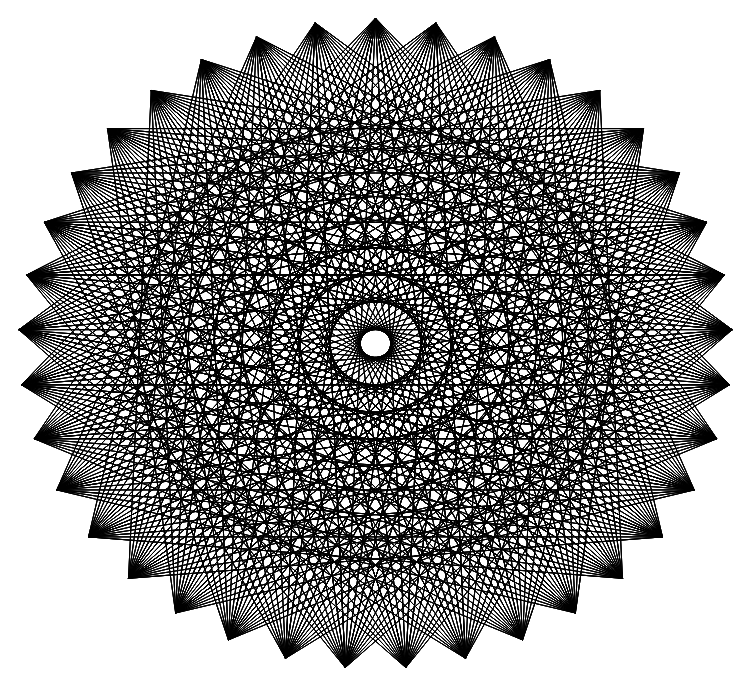
| Category | Series 0 |
|---|---|
| 0.0 | 1 |
| 0.0848059244755095 | -0.996 |
| -0.3331397947420577 | 0.943 |
| 0.6919388689775462 | -0.722 |
| -0.9775552389476861 | 0.211 |
| 0.8515291377333113 | 0.524 |
| -0.08480592447550882 | -0.996 |
| -0.8515291377333117 | 0.524 |
| 0.7506723052527243 | 0.661 |
| 0.5599747861375954 | -0.829 |
| -0.6282199972956423 | 0.778 |
| 0.8039971303669405 | -0.595 |
| -0.9775552389476861 | 0.211 |
| 0.9278890272965093 | 0.373 |
| -0.4119012482439926 | -0.911 |
| -0.4876949438136342 | 0.873 |
| 0.9990989662046814 | 0.042 |
| -0.2519780613851252 | -0.968 |
| -0.9278890272965095 | 0.373 |
| 0.9561667347392511 | -0.293 |
| -0.9990989662046815 | 0.042 |
| 0.9278890272965093 | 0.373 |
| -0.5599747861375949 | -0.829 |
| -0.16900082032184968 | 0.986 |
| 0.8929258581495685 | -0.45 |
| -0.8039971303669406 | -0.595 |
| -0.3331397947420577 | 0.943 |
| 0.9775552389476861 | 0.211 |
| -0.956166734739251 | -0.293 |
| 0.8515291377333113 | 0.524 |
| -0.5599747861375949 | -0.829 |
| 0.0 | 1 |
| 0.6919388689775462 | -0.722 |
| -0.9919004352588768 | -0.127 |
| 0.33313979474205757 | 0.943 |
| 0.8039971303669405 | -0.595 |
| -0.6919388689775461 | -0.722 |
| 0.6282199972956423 | 0.778 |
| -0.4119012482439926 | -0.911 |
| 0.0 | 1 |
| 0.5599747861375954 | -0.829 |
| -0.9775552389476861 | 0.211 |
| 0.7506723052527243 | 0.661 |
| 0.251978061385125 | -0.968 |
| -0.9990989662046815 | 0.042 |
| 0.16900082032184907 | 0.986 |
| -0.08480592447550882 | -0.996 |
| -0.16900082032184968 | 0.986 |
| 0.5599747861375954 | -0.829 |
| -0.9278890272965095 | 0.373 |
| 0.9278890272965093 | 0.373 |
| -0.2519780613851252 | -0.968 |
| -0.7506723052527245 | 0.661 |
| 0.8515291377333113 | 0.524 |
| 0.4119012482439928 | -0.911 |
| -0.4876949438136342 | 0.873 |
| 0.6919388689775462 | -0.722 |
| -0.9278890272965095 | 0.373 |
| 0.9775552389476861 | 0.211 |
| -0.5599747861375949 | -0.829 |
| -0.3331397947420577 | 0.943 |
| 0.9919004352588768 | -0.127 |
| -0.4119012482439926 | -0.911 |
| -0.8515291377333117 | 0.524 |
| 0.8929258581495685 | -0.45 |
| -0.9775552389476861 | 0.211 |
| 0.9775552389476861 | 0.211 |
| -0.6919388689775461 | -0.722 |
| 0.0 | 1 |
| 0.8039971303669405 | -0.595 |
| -0.8929258581495684 | -0.45 |
| -0.16900082032184968 | 0.986 |
| 0.9990989662046814 | 0.042 |
| -0.9919004352588768 | -0.127 |
| 0.9278890272965093 | 0.373 |
| -0.6919388689775461 | -0.722 |
| 0.16900082032184907 | 0.986 |
| 0.5599747861375954 | -0.829 |
| -0.9990989662046815 | 0.042 |
| 0.48769494381363454 | 0.873 |
| 0.6919388689775462 | -0.722 |
| -0.8039971303669406 | -0.595 |
| 0.7506723052527243 | 0.661 |
| -0.5599747861375949 | -0.829 |
| 0.16900082032184907 | 0.986 |
| 0.4119012482439928 | -0.911 |
| -0.9278890272965095 | 0.373 |
| 0.8515291377333113 | 0.524 |
| 0.0848059244755095 | -0.996 |
| -0.9775552389476861 | 0.211 |
| 0.33313979474205757 | 0.943 |
| -0.2519780613851252 | -0.968 |
| 0.0 | 1 |
| 0.4119012482439928 | -0.911 |
| -0.8515291377333117 | 0.524 |
| 0.9775552389476861 | 0.211 |
| -0.4119012482439926 | -0.911 |
| -0.6282199972956423 | 0.778 |
| 0.9278890272965093 | 0.373 |
| 0.251978061385125 | -0.968 |
| -0.3331397947420577 | 0.943 |
| 0.5599747861375954 | -0.829 |
| -0.8515291377333117 | 0.524 |
| 0.9990989662046814 | 0.042 |
| -0.6919388689775461 | -0.722 |
| -0.16900082032184968 | 0.986 |
| 0.9561667347392511 | -0.293 |
| -0.5599747861375949 | -0.829 |
| -0.7506723052527245 | 0.661 |
| 0.8039971303669405 | -0.595 |
| -0.9278890272965095 | 0.373 |
| 0.9990989662046814 | 0.042 |
| -0.8039971303669406 | -0.595 |
| 0.16900082032184907 | 0.986 |
| 0.6919388689775462 | -0.722 |
| -0.956166734739251 | -0.293 |
| 0.0 | 1 |
| 0.9919004352588768 | -0.127 |
| -0.9990989662046815 | 0.042 |
| 0.9775552389476861 | 0.211 |
| -0.8039971303669406 | -0.595 |
| 0.33313979474205757 | 0.943 |
| 0.4119012482439928 | -0.911 |
| -0.9775552389476861 | 0.211 |
| 0.6282199972956423 | 0.778 |
| 0.5599747861375954 | -0.829 |
| -0.8929258581495684 | -0.45 |
| 0.8515291377333113 | 0.524 |
| -0.6919388689775461 | -0.722 |
| 0.33313979474205757 | 0.943 |
| 0.251978061385125 | -0.968 |
| -0.8515291377333117 | 0.524 |
| 0.9278890272965093 | 0.373 |
| -0.08480592447550882 | -0.996 |
| -0.9278890272965095 | 0.373 |
| 0.48769494381363454 | 0.873 |
| -0.4119012482439926 | -0.911 |
| 0.16900082032184907 | 0.986 |
| 0.251978061385125 | -0.968 |
| -0.7506723052527245 | 0.661 |
| 0.9990989662046814 | 0.042 |
| -0.5599747861375949 | -0.829 |
| -0.4876949438136342 | 0.873 |
| 0.9775552389476861 | 0.211 |
| 0.0848059244755095 | -0.996 |
| -0.16900082032184968 | 0.986 |
| 0.4119012482439928 | -0.911 |
| -0.7506723052527245 | 0.661 |
| 0.9919004352588768 | -0.127 |
| -0.8039971303669406 | -0.595 |
| 0.0 | 1 |
| 0.8929258581495685 | -0.45 |
| -0.6919388689775461 | -0.722 |
| -0.6282199972956423 | 0.778 |
| 0.6919388689775462 | -0.722 |
| -0.8515291377333117 | 0.524 |
| 0.9919004352588768 | -0.127 |
| -0.8929258581495684 | -0.45 |
| 0.33313979474205757 | 0.943 |
| 0.5599747861375954 | -0.829 |
| -0.9919004352588768 | -0.127 |
| 0.16900082032184907 | 0.986 |
| 0.9561667347392511 | -0.293 |
| -0.9775552389476861 | 0.211 |
| 0.9990989662046814 | 0.042 |
| -0.8929258581495684 | -0.45 |
| 0.48769494381363454 | 0.873 |
| 0.251978061385125 | -0.968 |
| -0.9278890272965095 | 0.373 |
| 0.7506723052527243 | 0.661 |
| 0.4119012482439928 | -0.911 |
| -0.956166734739251 | -0.293 |
| 0.9278890272965093 | 0.373 |
| -0.8039971303669406 | -0.595 |
| 0.48769494381363454 | 0.873 |
| 0.0848059244755095 | -0.996 |
| -0.7506723052527245 | 0.661 |
| 0.9775552389476861 | 0.211 |
| -0.2519780613851252 | -0.968 |
| -0.8515291377333117 | 0.524 |
| 0.6282199972956423 | 0.778 |
| -0.5599747861375949 | -0.829 |
| 0.33313979474205757 | 0.943 |
| 0.0848059244755095 | -0.996 |
| -0.6282199972956423 | 0.778 |
| 0.9919004352588768 | -0.127 |
| -0.6919388689775461 | -0.722 |
| -0.3331397947420577 | 0.943 |
| 0.9990989662046814 | 0.042 |
| -0.08480592447550882 | -0.996 |
| 0.0 | 1 |
| 0.251978061385125 | -0.968 |
| -0.6282199972956423 | 0.778 |
| 0.9561667347392511 | -0.293 |
| -0.8929258581495684 | -0.45 |
| 0.16900082032184907 | 0.986 |
| 0.8039971303669405 | -0.595 |
| -0.8039971303669406 | -0.595 |
| -0.4876949438136342 | 0.873 |
| 0.5599747861375954 | -0.829 |
| -0.7506723052527245 | 0.661 |
| 0.9561667347392511 | -0.293 |
| -0.956166734739251 | -0.293 |
| 0.48769494381363454 | 0.873 |
| 0.4119012482439928 | -0.911 |
| -0.9990989662046815 | 0.042 |
| 0.33313979474205757 | 0.943 |
| 0.8929258581495685 | -0.45 |
| -0.9278890272965095 | 0.373 |
| 0.9919004352588768 | -0.127 |
| -0.956166734739251 | -0.293 |
| 0.6282199972956423 | 0.778 |
| 0.0848059244755095 | -0.996 |
| -0.8515291377333117 | 0.524 |
| 0.8515291377333113 | 0.524 |
| 0.251978061385125 | -0.968 |
| -0.9919004352588768 | -0.127 |
| 0.9775552389476861 | 0.211 |
| -0.8929258581495684 | -0.45 |
| 0.6282199972956423 | 0.778 |
| -0.08480592447550882 | -0.996 |
| -0.6282199972956423 | 0.778 |
| 0.9990989662046814 | 0.042 |
| -0.4119012482439926 | -0.911 |
| -0.7506723052527245 | 0.661 |
| 0.7506723052527243 | 0.661 |
| -0.6919388689775461 | -0.722 |
| 0.48769494381363454 | 0.873 |
| -0.08480592447550882 | -0.996 |
| -0.4876949438136342 | 0.873 |
| 0.9561667347392511 | -0.293 |
| -0.8039971303669406 | -0.595 |
| -0.16900082032184968 | 0.986 |
| 0.9919004352588768 | -0.127 |
| -0.2519780613851252 | -0.968 |
| 0.16900082032184907 | 0.986 |
| 0.0848059244755095 | -0.996 |
| -0.4876949438136342 | 0.873 |
| 0.8929258581495685 | -0.45 |
| -0.956166734739251 | -0.293 |
| 0.33313979474205757 | 0.943 |
| 0.6919388689775462 | -0.722 |
| -0.8929258581495684 | -0.45 |
| -0.3331397947420577 | 0.943 |
| 0.4119012482439928 | -0.911 |
| -0.6282199972956423 | 0.778 |
| 0.8929258581495685 | -0.45 |
| -0.9919004352588768 | -0.127 |
| 0.6282199972956423 | 0.778 |
| 0.251978061385125 | -0.968 |
| -0.9775552389476861 | 0.211 |
| 0.48769494381363454 | 0.873 |
| 0.8039971303669405 | -0.595 |
| -0.8515291377333117 | 0.524 |
| 0.9561667347392511 | -0.293 |
| -0.9919004352588768 | -0.127 |
| 0.7506723052527243 | 0.661 |
| -0.08480592447550882 | -0.996 |
| -0.7506723052527245 | 0.661 |
| 0.9278890272965093 | 0.373 |
| 0.0848059244755095 | -0.996 |
| -0.9990989662046815 | 0.042 |
| 0.9990989662046814 | 0.042 |
| -0.956166734739251 | -0.293 |
| 0.7506723052527243 | 0.661 |
| -0.2519780613851252 | -0.968 |
| -0.4876949438136342 | 0.873 |
| 0.9919004352588768 | -0.127 |
| -0.5599747861375949 | -0.829 |
| -0.6282199972956423 | 0.778 |
| 0.8515291377333113 | 0.524 |
| -0.8039971303669406 | -0.595 |
| 0.6282199972956423 | 0.778 |
| -0.2519780613851252 | -0.968 |
| -0.3331397947420577 | 0.943 |
| 0.8929258581495685 | -0.45 |
| -0.8929258581495684 | -0.45 |
| 0.0 | 1 |
| 0.9561667347392511 | -0.293 |
| -0.4119012482439926 | -0.911 |
| 0.33313979474205757 | 0.943 |
| -0.08480592447550882 | -0.996 |
| -0.3331397947420577 | 0.943 |
| 0.8039971303669405 | -0.595 |
| -0.9919004352588768 | -0.127 |
| 0.48769494381363454 | 0.873 |
| 0.5599747861375954 | -0.829 |
| -0.956166734739251 | -0.293 |
| -0.16900082032184968 | 0.986 |
| 0.251978061385125 | -0.968 |
| -0.4876949438136342 | 0.873 |
| 0.8039971303669405 | -0.595 |
| -0.9990989662046815 | 0.042 |
| 0.7506723052527243 | 0.661 |
| 0.0848059244755095 | -0.996 |
| -0.9278890272965095 | 0.373 |
| 0.6282199972956423 | 0.778 |
| 0.6919388689775462 | -0.722 |
| -0.7506723052527245 | 0.661 |
| 0.8929258581495685 | -0.45 |
| -0.9990989662046815 | 0.042 |
| 0.8515291377333113 | 0.524 |
| -0.2519780613851252 | -0.968 |
| -0.6282199972956423 | 0.778 |
| 0.9775552389476861 | 0.211 |
| -0.08480592447550882 | -0.996 |
| -0.9775552389476861 | 0.211 |
| 0.9919004352588768 | -0.127 |
| -0.9919004352588768 | -0.127 |
| 0.8515291377333113 | 0.524 |
| -0.4119012482439926 | -0.911 |
| -0.3331397947420577 | 0.943 |
| 0.9561667347392511 | -0.293 |
| -0.6919388689775461 | -0.722 |
| -0.4876949438136342 | 0.873 |
| 0.9278890272965093 | 0.373 |
| -0.8929258581495684 | -0.45 |
| 0.7506723052527243 | 0.661 |
| -0.4119012482439926 | -0.911 |
| -0.16900082032184968 | 0.986 |
| 0.8039971303669405 | -0.595 |
| -0.956166734739251 | -0.293 |
| 0.16900082032184907 | 0.986 |
| 0.8929258581495685 | -0.45 |
| -0.5599747861375949 | -0.829 |
| 0.48769494381363454 | 0.873 |
| -0.2519780613851252 | -0.968 |
| -0.16900082032184968 | 0.986 |
| 0.6919388689775462 | -0.722 |
| -0.9990989662046815 | 0.042 |
| 0.6282199972956423 | 0.778 |
| 0.4119012482439928 | -0.911 |
| -0.9919004352588768 | -0.127 |
| 0.0 | 1 |
| 0.0848059244755095 | -0.996 |
| -0.3331397947420577 | 0.943 |
| 0.6919388689775462 | -0.722 |
| -0.9775552389476861 | 0.211 |
| 0.8515291377333113 | 0.524 |
| -0.08480592447550882 | -0.996 |
| -0.8515291377333117 | 0.524 |
| 0.7506723052527243 | 0.661 |
| 0.5599747861375954 | -0.829 |
| -0.6282199972956423 | 0.778 |
| 0.8039971303669405 | -0.595 |
| -0.9775552389476861 | 0.211 |
| 0.9278890272965093 | 0.373 |
| -0.4119012482439926 | -0.911 |
| -0.4876949438136342 | 0.873 |
| 0.9990989662046814 | 0.042 |
| -0.2519780613851252 | -0.968 |
| -0.9278890272965095 | 0.373 |
| 0.9561667347392511 | -0.293 |
| -0.9990989662046815 | 0.042 |
| 0.9278890272965093 | 0.373 |
| -0.5599747861375949 | -0.829 |
| -0.16900082032184968 | 0.986 |
| 0.8929258581495685 | -0.45 |
| -0.8039971303669406 | -0.595 |
| -0.3331397947420577 | 0.943 |
| 0.9775552389476861 | 0.211 |
| -0.956166734739251 | -0.293 |
| 0.8515291377333113 | 0.524 |
| -0.5599747861375949 | -0.829 |
| 0.0 | 1 |
| 0.6919388689775462 | -0.722 |
| -0.9919004352588768 | -0.127 |
| 0.33313979474205757 | 0.943 |
| 0.8039971303669405 | -0.595 |
| -0.6919388689775461 | -0.722 |
| 0.6282199972956423 | 0.778 |
| -0.4119012482439926 | -0.911 |
| 0.0 | 1 |
| 0.5599747861375954 | -0.829 |
| -0.9775552389476861 | 0.211 |
| 0.7506723052527243 | 0.661 |
| 0.251978061385125 | -0.968 |
| -0.9990989662046815 | 0.042 |
| 0.16900082032184907 | 0.986 |
| -0.08480592447550882 | -0.996 |
| -0.16900082032184968 | 0.986 |
| 0.5599747861375954 | -0.829 |
| -0.9278890272965095 | 0.373 |
| 0.9278890272965093 | 0.373 |
| -0.2519780613851252 | -0.968 |
| -0.7506723052527245 | 0.661 |
| 0.8515291377333113 | 0.524 |
| 0.4119012482439928 | -0.911 |
| -0.4876949438136342 | 0.873 |
| 0.6919388689775462 | -0.722 |
| -0.9278890272965095 | 0.373 |
| 0.9775552389476861 | 0.211 |
| -0.5599747861375949 | -0.829 |
| -0.3331397947420577 | 0.943 |
| 0.9919004352588768 | -0.127 |
| -0.4119012482439926 | -0.911 |
| -0.8515291377333117 | 0.524 |
| 0.8929258581495685 | -0.45 |
| -0.9775552389476861 | 0.211 |
| 0.9775552389476861 | 0.211 |
| -0.6919388689775461 | -0.722 |
| 0.0 | 1 |
| 0.8039971303669405 | -0.595 |
| -0.8929258581495684 | -0.45 |
| -0.16900082032184968 | 0.986 |
| 0.9990989662046814 | 0.042 |
| -0.9919004352588768 | -0.127 |
| 0.9278890272965093 | 0.373 |
| -0.6919388689775461 | -0.722 |
| 0.16900082032184907 | 0.986 |
| 0.5599747861375954 | -0.829 |
| -0.9990989662046815 | 0.042 |
| 0.48769494381363454 | 0.873 |
| 0.6919388689775462 | -0.722 |
| -0.8039971303669406 | -0.595 |
| 0.7506723052527243 | 0.661 |
| -0.5599747861375949 | -0.829 |
| 0.16900082032184907 | 0.986 |
| 0.4119012482439928 | -0.911 |
| -0.9278890272965095 | 0.373 |
| 0.8515291377333113 | 0.524 |
| 0.0848059244755095 | -0.996 |
| -0.9775552389476861 | 0.211 |
| 0.33313979474205757 | 0.943 |
| -0.2519780613851252 | -0.968 |
| 0.0 | 1 |
| 0.4119012482439928 | -0.911 |
| -0.8515291377333117 | 0.524 |
| 0.9775552389476861 | 0.211 |
| -0.4119012482439926 | -0.911 |
| -0.6282199972956423 | 0.778 |
| 0.9278890272965093 | 0.373 |
| 0.251978061385125 | -0.968 |
| -0.3331397947420577 | 0.943 |
| 0.5599747861375954 | -0.829 |
| -0.8515291377333117 | 0.524 |
| 0.9990989662046814 | 0.042 |
| -0.6919388689775461 | -0.722 |
| -0.16900082032184968 | 0.986 |
| 0.9561667347392511 | -0.293 |
| -0.5599747861375949 | -0.829 |
| -0.7506723052527245 | 0.661 |
| 0.8039971303669405 | -0.595 |
| -0.9278890272965095 | 0.373 |
| 0.9990989662046814 | 0.042 |
| -0.8039971303669406 | -0.595 |
| 0.16900082032184907 | 0.986 |
| 0.6919388689775462 | -0.722 |
| -0.956166734739251 | -0.293 |
| 0.0 | 1 |
| 0.9919004352588768 | -0.127 |
| -0.9990989662046815 | 0.042 |
| 0.9775552389476861 | 0.211 |
| -0.8039971303669406 | -0.595 |
| 0.33313979474205757 | 0.943 |
| 0.4119012482439928 | -0.911 |
| -0.9775552389476861 | 0.211 |
| 0.6282199972956423 | 0.778 |
| 0.5599747861375954 | -0.829 |
| -0.8929258581495684 | -0.45 |
| 0.8515291377333113 | 0.524 |
| -0.6919388689775461 | -0.722 |
| 0.33313979474205757 | 0.943 |
| 0.251978061385125 | -0.968 |
| -0.8515291377333117 | 0.524 |
| 0.9278890272965093 | 0.373 |
| -0.08480592447550882 | -0.996 |
| -0.9278890272965095 | 0.373 |
| 0.48769494381363454 | 0.873 |
| -0.4119012482439926 | -0.911 |
| 0.16900082032184907 | 0.986 |
| 0.251978061385125 | -0.968 |
| -0.7506723052527245 | 0.661 |
| 0.9990989662046814 | 0.042 |
| -0.5599747861375949 | -0.829 |
| -0.4876949438136342 | 0.873 |
| 0.9775552389476861 | 0.211 |
| 0.0848059244755095 | -0.996 |
| -0.16900082032184968 | 0.986 |
| 0.4119012482439928 | -0.911 |
| -0.7506723052527245 | 0.661 |
| 0.9919004352588768 | -0.127 |
| -0.8039971303669406 | -0.595 |
| 0.0 | 1 |
| 0.8929258581495685 | -0.45 |
| -0.6919388689775461 | -0.722 |
| -0.6282199972956423 | 0.778 |
| 0.6919388689775462 | -0.722 |
| -0.8515291377333117 | 0.524 |
| 0.9919004352588768 | -0.127 |
| -0.8929258581495684 | -0.45 |
| 0.33313979474205757 | 0.943 |
| 0.5599747861375954 | -0.829 |
| -0.9919004352588768 | -0.127 |
| 0.16900082032184907 | 0.986 |
| 0.9561667347392511 | -0.293 |
| -0.9775552389476861 | 0.211 |
| 0.9990989662046814 | 0.042 |
| -0.8929258581495684 | -0.45 |
| 0.48769494381363454 | 0.873 |
| 0.251978061385125 | -0.968 |
| -0.9278890272965095 | 0.373 |
| 0.7506723052527243 | 0.661 |
| 0.4119012482439928 | -0.911 |
| -0.956166734739251 | -0.293 |
| 0.9278890272965093 | 0.373 |
| -0.8039971303669406 | -0.595 |
| 0.48769494381363454 | 0.873 |
| 0.0848059244755095 | -0.996 |
| -0.7506723052527245 | 0.661 |
| 0.9775552389476861 | 0.211 |
| -0.2519780613851252 | -0.968 |
| -0.8515291377333117 | 0.524 |
| 0.6282199972956423 | 0.778 |
| -0.5599747861375949 | -0.829 |
| 0.33313979474205757 | 0.943 |
| 0.0848059244755095 | -0.996 |
| -0.6282199972956423 | 0.778 |
| 0.9919004352588768 | -0.127 |
| -0.6919388689775461 | -0.722 |
| -0.3331397947420577 | 0.943 |
| 0.9990989662046814 | 0.042 |
| -0.08480592447550882 | -0.996 |
| 0.0 | 1 |
| 0.251978061385125 | -0.968 |
| -0.6282199972956423 | 0.778 |
| 0.9561667347392511 | -0.293 |
| -0.8929258581495684 | -0.45 |
| 0.16900082032184907 | 0.986 |
| 0.8039971303669405 | -0.595 |
| -0.8039971303669406 | -0.595 |
| -0.4876949438136342 | 0.873 |
| 0.5599747861375954 | -0.829 |
| -0.7506723052527245 | 0.661 |
| 0.9561667347392511 | -0.293 |
| -0.956166734739251 | -0.293 |
| 0.48769494381363454 | 0.873 |
| 0.4119012482439928 | -0.911 |
| -0.9990989662046815 | 0.042 |
| 0.33313979474205757 | 0.943 |
| 0.8929258581495685 | -0.45 |
| -0.9278890272965095 | 0.373 |
| 0.9919004352588768 | -0.127 |
| -0.956166734739251 | -0.293 |
| 0.6282199972956423 | 0.778 |
| 0.0848059244755095 | -0.996 |
| -0.8515291377333117 | 0.524 |
| 0.8515291377333113 | 0.524 |
| 0.251978061385125 | -0.968 |
| -0.9919004352588768 | -0.127 |
| 0.9775552389476861 | 0.211 |
| -0.8929258581495684 | -0.45 |
| 0.6282199972956423 | 0.778 |
| -0.08480592447550882 | -0.996 |
| -0.6282199972956423 | 0.778 |
| 0.9990989662046814 | 0.042 |
| -0.4119012482439926 | -0.911 |
| -0.7506723052527245 | 0.661 |
| 0.7506723052527243 | 0.661 |
| -0.6919388689775461 | -0.722 |
| 0.48769494381363454 | 0.873 |
| -0.08480592447550882 | -0.996 |
| -0.4876949438136342 | 0.873 |
| 0.9561667347392511 | -0.293 |
| -0.8039971303669406 | -0.595 |
| -0.16900082032184968 | 0.986 |
| 0.9919004352588768 | -0.127 |
| -0.2519780613851252 | -0.968 |
| 0.16900082032184907 | 0.986 |
| 0.0848059244755095 | -0.996 |
| -0.4876949438136342 | 0.873 |
| 0.8929258581495685 | -0.45 |
| -0.956166734739251 | -0.293 |
| 0.33313979474205757 | 0.943 |
| 0.6919388689775462 | -0.722 |
| -0.8929258581495684 | -0.45 |
| -0.3331397947420577 | 0.943 |
| 0.4119012482439928 | -0.911 |
| -0.6282199972956423 | 0.778 |
| 0.8929258581495685 | -0.45 |
| -0.9919004352588768 | -0.127 |
| 0.6282199972956423 | 0.778 |
| 0.251978061385125 | -0.968 |
| -0.9775552389476861 | 0.211 |
| 0.48769494381363454 | 0.873 |
| 0.8039971303669405 | -0.595 |
| -0.8515291377333117 | 0.524 |
| 0.9561667347392511 | -0.293 |
| -0.9919004352588768 | -0.127 |
| 0.7506723052527243 | 0.661 |
| -0.08480592447550882 | -0.996 |
| -0.7506723052527245 | 0.661 |
| 0.9278890272965093 | 0.373 |
| 0.0848059244755095 | -0.996 |
| -0.9990989662046815 | 0.042 |
| 0.9990989662046814 | 0.042 |
| -0.956166734739251 | -0.293 |
| 0.7506723052527243 | 0.661 |
| -0.2519780613851252 | -0.968 |
| -0.4876949438136342 | 0.873 |
| 0.9919004352588768 | -0.127 |
| -0.5599747861375949 | -0.829 |
| -0.6282199972956423 | 0.778 |
| 0.8515291377333113 | 0.524 |
| -0.8039971303669406 | -0.595 |
| 0.6282199972956423 | 0.778 |
| -0.2519780613851252 | -0.968 |
| -0.3331397947420577 | 0.943 |
| 0.8929258581495685 | -0.45 |
| -0.8929258581495684 | -0.45 |
| 0.0 | 1 |
| 0.9561667347392511 | -0.293 |
| -0.4119012482439926 | -0.911 |
| 0.33313979474205757 | 0.943 |
| -0.08480592447550882 | -0.996 |
| -0.3331397947420577 | 0.943 |
| 0.8039971303669405 | -0.595 |
| -0.9919004352588768 | -0.127 |
| 0.48769494381363454 | 0.873 |
| 0.5599747861375954 | -0.829 |
| -0.956166734739251 | -0.293 |
| -0.16900082032184968 | 0.986 |
| 0.251978061385125 | -0.968 |
| -0.4876949438136342 | 0.873 |
| 0.8039971303669405 | -0.595 |
| -0.9990989662046815 | 0.042 |
| 0.7506723052527243 | 0.661 |
| 0.0848059244755095 | -0.996 |
| -0.9278890272965095 | 0.373 |
| 0.6282199972956423 | 0.778 |
| 0.6919388689775462 | -0.722 |
| -0.7506723052527245 | 0.661 |
| 0.8929258581495685 | -0.45 |
| -0.9990989662046815 | 0.042 |
| 0.8515291377333113 | 0.524 |
| -0.2519780613851252 | -0.968 |
| -0.6282199972956423 | 0.778 |
| 0.9775552389476861 | 0.211 |
| -0.08480592447550882 | -0.996 |
| -0.9775552389476861 | 0.211 |
| 0.9919004352588768 | -0.127 |
| -0.9919004352588768 | -0.127 |
| 0.8515291377333113 | 0.524 |
| -0.4119012482439926 | -0.911 |
| -0.3331397947420577 | 0.943 |
| 0.9561667347392511 | -0.293 |
| -0.6919388689775461 | -0.722 |
| -0.4876949438136342 | 0.873 |
| 0.9278890272965093 | 0.373 |
| -0.8929258581495684 | -0.45 |
| 0.7506723052527243 | 0.661 |
| -0.4119012482439926 | -0.911 |
| -0.16900082032184968 | 0.986 |
| 0.8039971303669405 | -0.595 |
| -0.956166734739251 | -0.293 |
| 0.16900082032184907 | 0.986 |
| 0.8929258581495685 | -0.45 |
| -0.5599747861375949 | -0.829 |
| 0.48769494381363454 | 0.873 |
| -0.2519780613851252 | -0.968 |
| -0.16900082032184968 | 0.986 |
| 0.6919388689775462 | -0.722 |
| -0.9990989662046815 | 0.042 |
| 0.6282199972956423 | 0.778 |
| 0.4119012482439928 | -0.911 |
| -0.9919004352588768 | -0.127 |
| 0.0 | 1 |
| 0.0848059244755095 | -0.996 |
| -0.3331397947420577 | 0.943 |
| 0.6919388689775462 | -0.722 |
| -0.9775552389476861 | 0.211 |
| 0.8515291377333113 | 0.524 |
| -0.08480592447550882 | -0.996 |
| -0.8515291377333117 | 0.524 |
| 0.7506723052527243 | 0.661 |
| 0.5599747861375954 | -0.829 |
| -0.6282199972956423 | 0.778 |
| 0.8039971303669405 | -0.595 |
| -0.9775552389476861 | 0.211 |
| 0.9278890272965093 | 0.373 |
| -0.4119012482439926 | -0.911 |
| -0.4876949438136342 | 0.873 |
| 0.9990989662046814 | 0.042 |
| -0.2519780613851252 | -0.968 |
| -0.9278890272965095 | 0.373 |
| 0.9561667347392511 | -0.293 |
| -0.9990989662046815 | 0.042 |
| 0.9278890272965093 | 0.373 |
| -0.5599747861375949 | -0.829 |
| -0.16900082032184968 | 0.986 |
| 0.8929258581495685 | -0.45 |
| -0.8039971303669406 | -0.595 |
| -0.3331397947420577 | 0.943 |
| 0.9775552389476861 | 0.211 |
| -0.956166734739251 | -0.293 |
| 0.8515291377333113 | 0.524 |
| -0.5599747861375949 | -0.829 |
| 0.0 | 1 |
| 0.6919388689775462 | -0.722 |
| -0.9919004352588768 | -0.127 |
| 0.33313979474205757 | 0.943 |
| 0.8039971303669405 | -0.595 |
| -0.6919388689775461 | -0.722 |
| 0.6282199972956423 | 0.778 |
| -0.4119012482439926 | -0.911 |
| 0.0 | 1 |
| 0.5599747861375954 | -0.829 |
| -0.9775552389476861 | 0.211 |
| 0.7506723052527243 | 0.661 |
| 0.251978061385125 | -0.968 |
| -0.9990989662046815 | 0.042 |
| 0.16900082032184907 | 0.986 |
| -0.08480592447550882 | -0.996 |
| -0.16900082032184968 | 0.986 |
| 0.5599747861375954 | -0.829 |
| -0.9278890272965095 | 0.373 |
| 0.9278890272965093 | 0.373 |
| -0.2519780613851252 | -0.968 |
| -0.7506723052527245 | 0.661 |
| 0.8515291377333113 | 0.524 |
| 0.4119012482439928 | -0.911 |
| -0.4876949438136342 | 0.873 |
| 0.6919388689775462 | -0.722 |
| -0.9278890272965095 | 0.373 |
| 0.9775552389476861 | 0.211 |
| -0.5599747861375949 | -0.829 |
| -0.3331397947420577 | 0.943 |
| 0.9919004352588768 | -0.127 |
| -0.4119012482439926 | -0.911 |
| -0.8515291377333117 | 0.524 |
| 0.8929258581495685 | -0.45 |
| -0.9775552389476861 | 0.211 |
| 0.9775552389476861 | 0.211 |
| -0.6919388689775461 | -0.722 |
| 0.0 | 1 |
| 0.8039971303669405 | -0.595 |
| -0.8929258581495684 | -0.45 |
| -0.16900082032184968 | 0.986 |
| 0.9990989662046814 | 0.042 |
| -0.9919004352588768 | -0.127 |
| 0.9278890272965093 | 0.373 |
| -0.6919388689775461 | -0.722 |
| 0.16900082032184907 | 0.986 |
| 0.5599747861375954 | -0.829 |
| -0.9990989662046815 | 0.042 |
| 0.48769494381363454 | 0.873 |
| 0.6919388689775462 | -0.722 |
| -0.8039971303669406 | -0.595 |
| 0.7506723052527243 | 0.661 |
| -0.5599747861375949 | -0.829 |
| 0.16900082032184907 | 0.986 |
| 0.4119012482439928 | -0.911 |
| -0.9278890272965095 | 0.373 |
| 0.8515291377333113 | 0.524 |
| 0.0848059244755095 | -0.996 |
| -0.9775552389476861 | 0.211 |
| 0.33313979474205757 | 0.943 |
| -0.2519780613851252 | -0.968 |
| 0.0 | 1 |
| 0.4119012482439928 | -0.911 |
| -0.8515291377333117 | 0.524 |
| 0.9775552389476861 | 0.211 |
| -0.4119012482439926 | -0.911 |
| -0.6282199972956423 | 0.778 |
| 0.9278890272965093 | 0.373 |
| 0.251978061385125 | -0.968 |
| -0.3331397947420577 | 0.943 |
| 0.5599747861375954 | -0.829 |
| -0.8515291377333117 | 0.524 |
| 0.9990989662046814 | 0.042 |
| -0.6919388689775461 | -0.722 |
| -0.16900082032184968 | 0.986 |
| 0.9561667347392511 | -0.293 |
| -0.5599747861375949 | -0.829 |
| -0.7506723052527245 | 0.661 |
| 0.8039971303669405 | -0.595 |
| -0.9278890272965095 | 0.373 |
| 0.9990989662046814 | 0.042 |
| -0.8039971303669406 | -0.595 |
| 0.16900082032184907 | 0.986 |
| 0.6919388689775462 | -0.722 |
| -0.956166734739251 | -0.293 |
| 0.0 | 1 |
| 0.9919004352588768 | -0.127 |
| -0.9990989662046815 | 0.042 |
| 0.9775552389476861 | 0.211 |
| -0.8039971303669406 | -0.595 |
| 0.33313979474205757 | 0.943 |
| 0.4119012482439928 | -0.911 |
| -0.9775552389476861 | 0.211 |
| 0.6282199972956423 | 0.778 |
| 0.5599747861375954 | -0.829 |
| -0.8929258581495684 | -0.45 |
| 0.8515291377333113 | 0.524 |
| -0.6919388689775461 | -0.722 |
| 0.33313979474205757 | 0.943 |
| 0.251978061385125 | -0.968 |
| -0.8515291377333117 | 0.524 |
| 0.9278890272965093 | 0.373 |
| -0.08480592447550882 | -0.996 |
| -0.9278890272965095 | 0.373 |
| 0.48769494381363454 | 0.873 |
| -0.4119012482439926 | -0.911 |
| 0.16900082032184907 | 0.986 |
| 0.251978061385125 | -0.968 |
| -0.7506723052527245 | 0.661 |
| 0.9990989662046814 | 0.042 |
| -0.5599747861375949 | -0.829 |
| -0.4876949438136342 | 0.873 |
| 0.9775552389476861 | 0.211 |
| 0.0848059244755095 | -0.996 |
| -0.16900082032184968 | 0.986 |
| 0.4119012482439928 | -0.911 |
| -0.7506723052527245 | 0.661 |
| 0.9919004352588768 | -0.127 |
| -0.8039971303669406 | -0.595 |
| 0.0 | 1 |
| 0.8929258581495685 | -0.45 |
| -0.6919388689775461 | -0.722 |
| -0.6282199972956423 | 0.778 |
| 0.6919388689775462 | -0.722 |
| -0.8515291377333117 | 0.524 |
| 0.9919004352588768 | -0.127 |
| -0.8929258581495684 | -0.45 |
| 0.33313979474205757 | 0.943 |
| 0.5599747861375954 | -0.829 |
| -0.9919004352588768 | -0.127 |
| 0.16900082032184907 | 0.986 |
| 0.9561667347392511 | -0.293 |
| -0.9775552389476861 | 0.211 |
| 0.9990989662046814 | 0.042 |
| -0.8929258581495684 | -0.45 |
| 0.48769494381363454 | 0.873 |
| 0.251978061385125 | -0.968 |
| -0.9278890272965095 | 0.373 |
| 0.7506723052527243 | 0.661 |
| 0.4119012482439928 | -0.911 |
| -0.956166734739251 | -0.293 |
| 0.9278890272965093 | 0.373 |
| -0.8039971303669406 | -0.595 |
| 0.48769494381363454 | 0.873 |
| 0.0848059244755095 | -0.996 |
| -0.7506723052527245 | 0.661 |
| 0.9775552389476861 | 0.211 |
| -0.2519780613851252 | -0.968 |
| -0.8515291377333117 | 0.524 |
| 0.6282199972956423 | 0.778 |
| -0.5599747861375949 | -0.829 |
| 0.33313979474205757 | 0.943 |
| 0.0848059244755095 | -0.996 |
| -0.6282199972956423 | 0.778 |
| 0.9919004352588768 | -0.127 |
| -0.6919388689775461 | -0.722 |
| -0.3331397947420577 | 0.943 |
| 0.9990989662046814 | 0.042 |
| -0.08480592447550882 | -0.996 |
| 0.0 | 1 |
| 0.251978061385125 | -0.968 |
| -0.6282199972956423 | 0.778 |
| 0.9561667347392511 | -0.293 |
| -0.8929258581495684 | -0.45 |
| 0.16900082032184907 | 0.986 |
| 0.8039971303669405 | -0.595 |
| -0.8039971303669406 | -0.595 |
| -0.4876949438136342 | 0.873 |
| 0.5599747861375954 | -0.829 |
| -0.7506723052527245 | 0.661 |
| 0.9561667347392511 | -0.293 |
| -0.956166734739251 | -0.293 |
| 0.48769494381363454 | 0.873 |
| 0.4119012482439928 | -0.911 |
| -0.9990989662046815 | 0.042 |
| 0.33313979474205757 | 0.943 |
| 0.8929258581495685 | -0.45 |
| -0.9278890272965095 | 0.373 |
| 0.9919004352588768 | -0.127 |
| -0.956166734739251 | -0.293 |
| 0.6282199972956423 | 0.778 |
| 0.0848059244755095 | -0.996 |
| -0.8515291377333117 | 0.524 |
| 0.8515291377333113 | 0.524 |
| 0.251978061385125 | -0.968 |
| -0.9919004352588768 | -0.127 |
| 0.9775552389476861 | 0.211 |
| -0.8929258581495684 | -0.45 |
| 0.6282199972956423 | 0.778 |
| -0.08480592447550882 | -0.996 |
| -0.6282199972956423 | 0.778 |
| 0.9990989662046814 | 0.042 |
| -0.4119012482439926 | -0.911 |
| -0.7506723052527245 | 0.661 |
| 0.7506723052527243 | 0.661 |
| -0.6919388689775461 | -0.722 |
| 0.48769494381363454 | 0.873 |
| -0.08480592447550882 | -0.996 |
| -0.4876949438136342 | 0.873 |
| 0.9561667347392511 | -0.293 |
| -0.8039971303669406 | -0.595 |
| -0.16900082032184968 | 0.986 |
| 0.9919004352588768 | -0.127 |
| -0.2519780613851252 | -0.968 |
| 0.16900082032184907 | 0.986 |
| 0.0848059244755095 | -0.996 |
| -0.4876949438136342 | 0.873 |
| 0.8929258581495685 | -0.45 |
| -0.956166734739251 | -0.293 |
| 0.33313979474205757 | 0.943 |
| 0.6919388689775462 | -0.722 |
| -0.8929258581495684 | -0.45 |
| -0.3331397947420577 | 0.943 |
| 0.4119012482439928 | -0.911 |
| -0.6282199972956423 | 0.778 |
| 0.8929258581495685 | -0.45 |
| -0.9919004352588768 | -0.127 |
| 0.6282199972956423 | 0.778 |
| 0.251978061385125 | -0.968 |
| -0.9775552389476861 | 0.211 |
| 0.48769494381363454 | 0.873 |
| 0.8039971303669405 | -0.595 |
| -0.8515291377333117 | 0.524 |
| 0.9561667347392511 | -0.293 |
| -0.9919004352588768 | -0.127 |
| 0.7506723052527243 | 0.661 |
| -0.08480592447550882 | -0.996 |
| -0.7506723052527245 | 0.661 |
| 0.9278890272965093 | 0.373 |
| 0.0848059244755095 | -0.996 |
| -0.9990989662046815 | 0.042 |
| 0.9990989662046814 | 0.042 |
| -0.956166734739251 | -0.293 |
| 0.7506723052527243 | 0.661 |
| -0.2519780613851252 | -0.968 |
| -0.4876949438136342 | 0.873 |
| 0.9919004352588768 | -0.127 |
| -0.5599747861375949 | -0.829 |
| -0.6282199972956423 | 0.778 |
| 0.8515291377333113 | 0.524 |
| -0.8039971303669406 | -0.595 |
| 0.6282199972956423 | 0.778 |
| -0.2519780613851252 | -0.968 |
| -0.3331397947420577 | 0.943 |
| 0.8929258581495685 | -0.45 |
| -0.8929258581495684 | -0.45 |
| 0.0 | 1 |
| 0.9561667347392511 | -0.293 |
| -0.4119012482439926 | -0.911 |
| 0.33313979474205757 | 0.943 |
| -0.08480592447550882 | -0.996 |
| -0.3331397947420577 | 0.943 |
| 0.8039971303669405 | -0.595 |
| -0.9919004352588768 | -0.127 |
| 0.48769494381363454 | 0.873 |
| 0.5599747861375954 | -0.829 |
| -0.956166734739251 | -0.293 |
| -0.16900082032184968 | 0.986 |
| 0.251978061385125 | -0.968 |
| -0.4876949438136342 | 0.873 |
| 0.8039971303669405 | -0.595 |
| -0.9990989662046815 | 0.042 |
| 0.7506723052527243 | 0.661 |
| 0.0848059244755095 | -0.996 |
| -0.9278890272965095 | 0.373 |
| 0.6282199972956423 | 0.778 |
| 0.6919388689775462 | -0.722 |
| -0.7506723052527245 | 0.661 |
| 0.8929258581495685 | -0.45 |
| -0.9990989662046815 | 0.042 |
| 0.8515291377333113 | 0.524 |
| -0.2519780613851252 | -0.968 |
| -0.6282199972956423 | 0.778 |
| 0.9775552389476861 | 0.211 |
| -0.08480592447550882 | -0.996 |
| -0.9775552389476861 | 0.211 |
| 0.9919004352588768 | -0.127 |
| -0.9919004352588768 | -0.127 |
| 0.8515291377333113 | 0.524 |
| -0.4119012482439926 | -0.911 |
| -0.3331397947420577 | 0.943 |
| 0.9561667347392511 | -0.293 |
| -0.6919388689775461 | -0.722 |
| -0.4876949438136342 | 0.873 |
| 0.9278890272965093 | 0.373 |
| -0.8929258581495684 | -0.45 |
| 0.7506723052527243 | 0.661 |
| -0.4119012482439926 | -0.911 |
| -0.16900082032184968 | 0.986 |
| 0.8039971303669405 | -0.595 |
| -0.956166734739251 | -0.293 |
| 0.16900082032184907 | 0.986 |
| 0.8929258581495685 | -0.45 |
| -0.5599747861375949 | -0.829 |
| 0.48769494381363454 | 0.873 |
| -0.2519780613851252 | -0.968 |
| -0.16900082032184968 | 0.986 |
| 0.6919388689775462 | -0.722 |
| -0.9990989662046815 | 0.042 |
| 0.6282199972956423 | 0.778 |
| 0.4119012482439928 | -0.911 |
| -0.9919004352588768 | -0.127 |
| 0.0 | 1 |
| 0.0848059244755095 | -0.996 |
| -0.3331397947420577 | 0.943 |
| 0.6919388689775462 | -0.722 |
| -0.9775552389476861 | 0.211 |
| 0.8515291377333113 | 0.524 |
| -0.08480592447550882 | -0.996 |
| -0.8515291377333117 | 0.524 |
| 0.7506723052527243 | 0.661 |
| 0.5599747861375954 | -0.829 |
| -0.6282199972956423 | 0.778 |
| 0.8039971303669405 | -0.595 |
| -0.9775552389476861 | 0.211 |
| 0.9278890272965093 | 0.373 |
| -0.4119012482439926 | -0.911 |
| -0.4876949438136342 | 0.873 |
| 0.9990989662046814 | 0.042 |
| -0.2519780613851252 | -0.968 |
| -0.9278890272965095 | 0.373 |
| 0.9561667347392511 | -0.293 |
| -0.9990989662046815 | 0.042 |
| 0.9278890272965093 | 0.373 |
| -0.5599747861375949 | -0.829 |
| -0.16900082032184968 | 0.986 |
| 0.8929258581495685 | -0.45 |
| -0.8039971303669406 | -0.595 |
| -0.3331397947420577 | 0.943 |
| 0.9775552389476861 | 0.211 |
| -0.956166734739251 | -0.293 |
| 0.8515291377333113 | 0.524 |
| -0.5599747861375949 | -0.829 |
| 0.0 | 1 |
| 0.6919388689775462 | -0.722 |
| -0.9919004352588768 | -0.127 |
| 0.33313979474205757 | 0.943 |
| 0.8039971303669405 | -0.595 |
| -0.6919388689775461 | -0.722 |
| 0.6282199972956423 | 0.778 |
| -0.4119012482439926 | -0.911 |
| 0.0 | 1 |
| 0.5599747861375954 | -0.829 |
| -0.9775552389476861 | 0.211 |
| 0.7506723052527243 | 0.661 |
| 0.251978061385125 | -0.968 |
| -0.9990989662046815 | 0.042 |
| 0.16900082032184907 | 0.986 |
| -0.08480592447550882 | -0.996 |
| -0.16900082032184968 | 0.986 |
| 0.5599747861375954 | -0.829 |
| -0.9278890272965095 | 0.373 |
| 0.9278890272965093 | 0.373 |
| -0.2519780613851252 | -0.968 |
| -0.7506723052527245 | 0.661 |
| 0.8515291377333113 | 0.524 |
| 0.4119012482439928 | -0.911 |
| -0.4876949438136342 | 0.873 |
| 0.6919388689775462 | -0.722 |
| -0.9278890272965095 | 0.373 |
| 0.9775552389476861 | 0.211 |
| -0.5599747861375949 | -0.829 |
| -0.3331397947420577 | 0.943 |
| 0.9919004352588768 | -0.127 |
| -0.4119012482439926 | -0.911 |
| -0.8515291377333117 | 0.524 |
| 0.8929258581495685 | -0.45 |
| -0.9775552389476861 | 0.211 |
| 0.9775552389476861 | 0.211 |
| -0.6919388689775461 | -0.722 |
| 0.0 | 1 |
| 0.8039971303669405 | -0.595 |
| -0.8929258581495684 | -0.45 |
| -0.16900082032184968 | 0.986 |
| 0.9990989662046814 | 0.042 |
| -0.9919004352588768 | -0.127 |
| 0.9278890272965093 | 0.373 |
| -0.6919388689775461 | -0.722 |
| 0.16900082032184907 | 0.986 |
| 0.5599747861375954 | -0.829 |
| -0.9990989662046815 | 0.042 |
| 0.48769494381363454 | 0.873 |
| 0.6919388689775462 | -0.722 |
| -0.8039971303669406 | -0.595 |